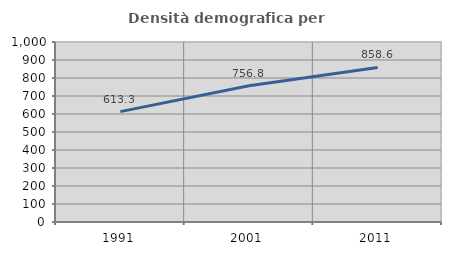
| Category | Densità demografica |
|---|---|
| 1991.0 | 613.315 |
| 2001.0 | 756.793 |
| 2011.0 | 858.64 |